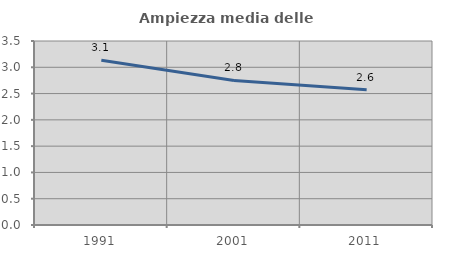
| Category | Ampiezza media delle famiglie |
|---|---|
| 1991.0 | 3.135 |
| 2001.0 | 2.75 |
| 2011.0 | 2.572 |